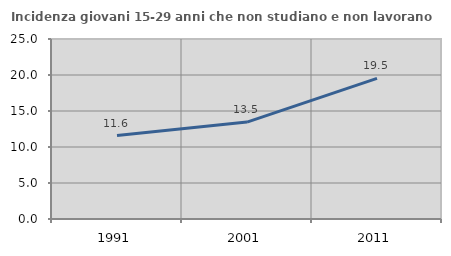
| Category | Incidenza giovani 15-29 anni che non studiano e non lavorano  |
|---|---|
| 1991.0 | 11.589 |
| 2001.0 | 13.465 |
| 2011.0 | 19.525 |